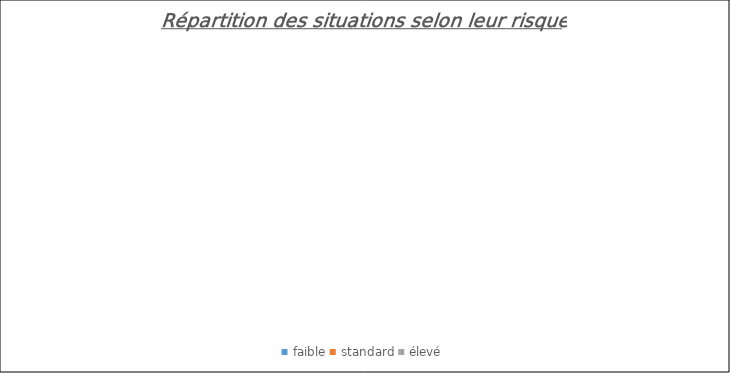
| Category | Series 0 |
|---|---|
| faible | 0 |
| standard | 0 |
| élevé | 0 |